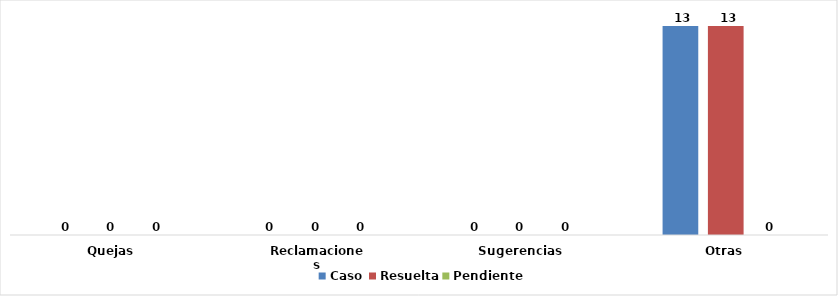
| Category | Caso | Resuelta | Pendiente |
|---|---|---|---|
| Quejas | 0 | 0 | 0 |
| Reclamaciones | 0 | 0 | 0 |
| Sugerencias | 0 | 0 | 0 |
| Otras | 13 | 13 | 0 |